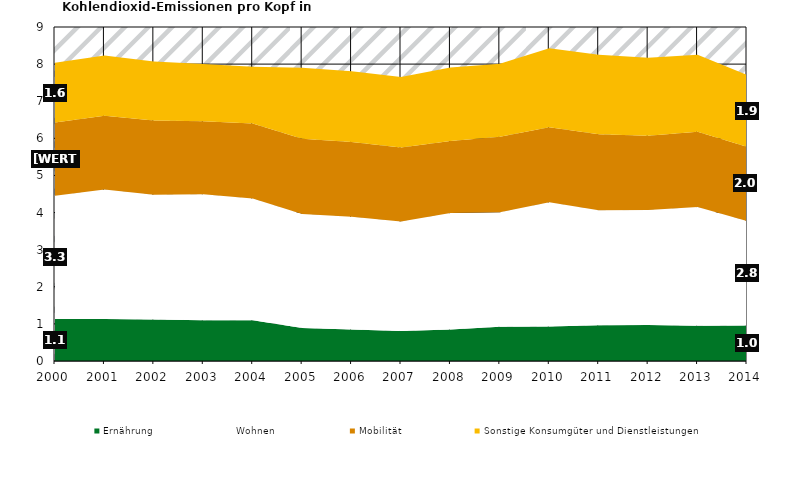
| Category | Ernährung | Wohnen | Mobilität | Sonstige Konsumgüter und Dienstleistungen |
|---|---|---|---|---|
| 2000.0 | 1.13 | 3.32 | 1.98 | 1.61 |
| 2001.0 | 1.13 | 3.49 | 1.99 | 1.62 |
| 2002.0 | 1.12 | 3.36 | 2 | 1.59 |
| 2003.0 | 1.1 | 3.39 | 1.97 | 1.54 |
| 2004.0 | 1.1 | 3.28 | 2.02 | 1.53 |
| 2005.0 | 0.89 | 3.07 | 2.03 | 1.91 |
| 2006.0 | 0.85 | 3.04 | 2.01 | 1.91 |
| 2007.0 | 0.81 | 2.95 | 1.99 | 1.9 |
| 2008.0 | 0.85 | 3.14 | 1.94 | 1.98 |
| 2009.0 | 0.92 | 3.09 | 2.03 | 1.97 |
| 2010.0 | 0.93 | 3.35 | 2.02 | 2.13 |
| 2011.0 | 0.96 | 3.1 | 2.05 | 2.14 |
| 2012.0 | 0.97 | 3.1 | 2 | 2.1 |
| 2013.0 | 0.95 | 3.2 | 2.03 | 2.07 |
| 2014.0 | 0.96 | 2.81 | 2 | 1.94 |